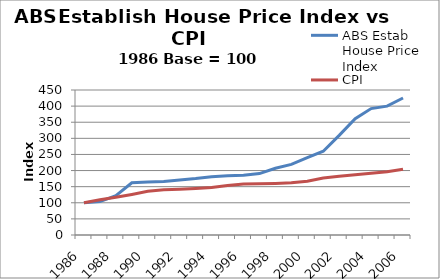
| Category | ABS Estab House Price Index | CPI |
|---|---|---|
| 1986.0 | 100 | 100 |
| 1987.0 | 103.8 | 109.3 |
| 1988.0 | 121.7 | 117.1 |
| 1989.0 | 162 | 125.9 |
| 1990.0 | 164.8 | 135.6 |
| 1991.0 | 166.1 | 140.2 |
| 1992.0 | 170.5 | 141.9 |
| 1993.0 | 175 | 144.6 |
| 1994.0 | 180.9 | 147.1 |
| 1995.0 | 183.9 | 153.7 |
| 1996.0 | 185.3 | 158.5 |
| 1997.0 | 190.5 | 159 |
| 1998.0 | 207 | 160.1 |
| 1999.0 | 219.1 | 161.8 |
| 2000.0 | 240.3 | 166.9 |
| 2001.0 | 260 | 177 |
| 2002.0 | 309.1 | 182 |
| 2003.0 | 360.9 | 186.9 |
| 2004.0 | 392.3 | 191.5 |
| 2005.0 | 399.8 | 196.3 |
| 2006.0 | 425.3 | 204.1 |